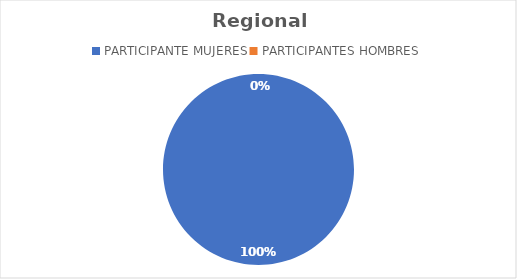
| Category | Regional Norte |
|---|---|
| PARTICIPANTE MUJERES | 40 |
| PARTICIPANTES HOMBRES | 0 |